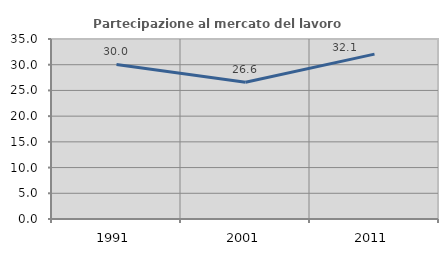
| Category | Partecipazione al mercato del lavoro  femminile |
|---|---|
| 1991.0 | 30.044 |
| 2001.0 | 26.602 |
| 2011.0 | 32.061 |